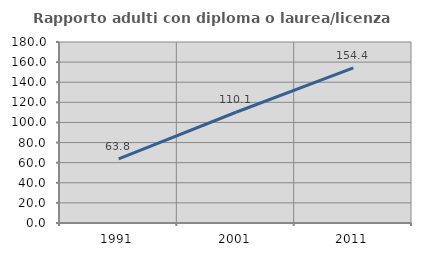
| Category | Rapporto adulti con diploma o laurea/licenza media  |
|---|---|
| 1991.0 | 63.792 |
| 2001.0 | 110.137 |
| 2011.0 | 154.361 |